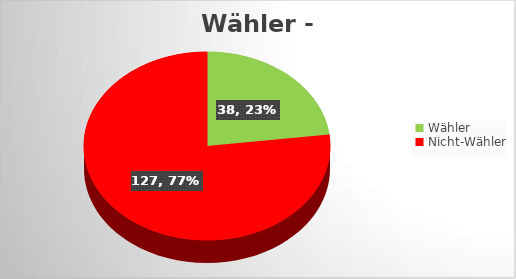
| Category | Series 0 |
|---|---|
| Wähler | 38 |
| Nicht-Wähler | 127 |